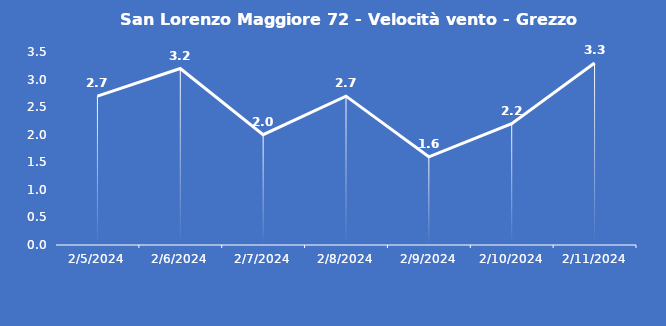
| Category | San Lorenzo Maggiore 72 - Velocità vento - Grezzo (m/s) |
|---|---|
| 2/5/24 | 2.7 |
| 2/6/24 | 3.2 |
| 2/7/24 | 2 |
| 2/8/24 | 2.7 |
| 2/9/24 | 1.6 |
| 2/10/24 | 2.2 |
| 2/11/24 | 3.3 |